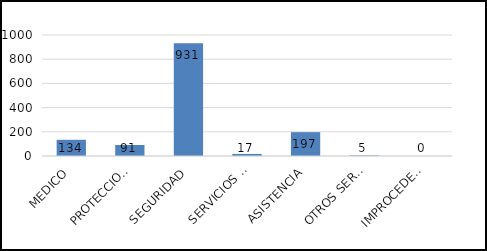
| Category | TOTAL |
|---|---|
| MEDICO | 134 |
| PROTECCION CIVIL | 91 |
| SEGURIDAD | 931 |
| SERVICIOS PUBLICOS | 17 |
| ASISTENCIA | 197 |
| OTROS SERVICIOS | 5 |
| IMPROCEDENTES | 0 |